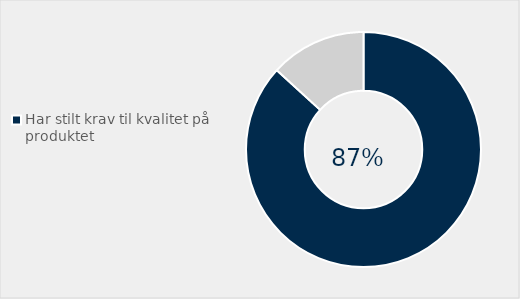
| Category | Series 0 |
|---|---|
| Har stilt krav til kvalitet på produktet | 0.868 |
| Har ikke stilt krav til sirkulær økonomi | 0.132 |